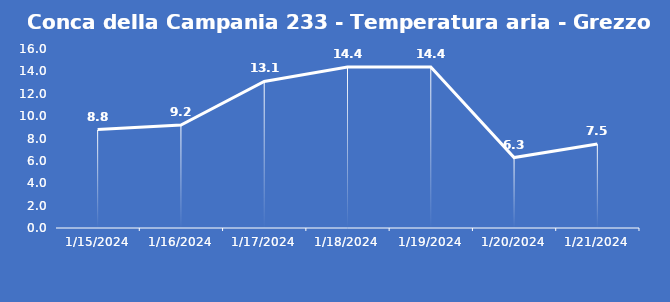
| Category | Conca della Campania 233 - Temperatura aria - Grezzo (°C) |
|---|---|
| 1/15/24 | 8.8 |
| 1/16/24 | 9.2 |
| 1/17/24 | 13.1 |
| 1/18/24 | 14.4 |
| 1/19/24 | 14.4 |
| 1/20/24 | 6.3 |
| 1/21/24 | 7.5 |